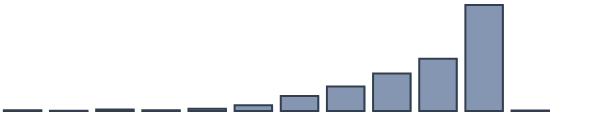
| Category | Series 0 |
|---|---|
| 0 | 0.3 |
| 1 | 0.1 |
| 2 | 0.6 |
| 3 | 0.3 |
| 4 | 0.9 |
| 5 | 2.3 |
| 6 | 6.1 |
| 7 | 9.9 |
| 8 | 15.2 |
| 9 | 21.2 |
| 10 | 43 |
| 11 | 0.2 |
| 12 | 0 |